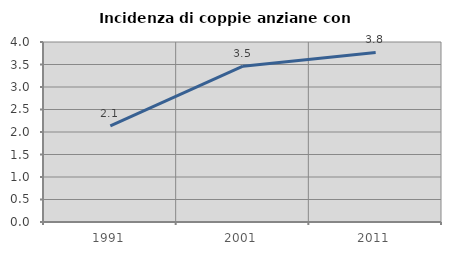
| Category | Incidenza di coppie anziane con figli |
|---|---|
| 1991.0 | 2.135 |
| 2001.0 | 3.463 |
| 2011.0 | 3.768 |